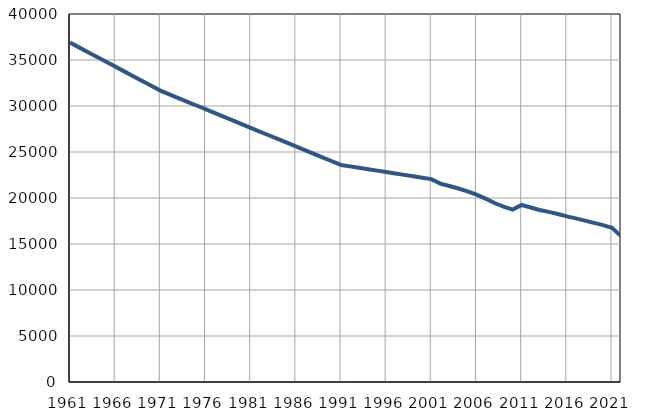
| Category | Population
size |
|---|---|
| 1961.0 | 36896 |
| 1962.0 | 36374 |
| 1963.0 | 35851 |
| 1964.0 | 35328 |
| 1965.0 | 34806 |
| 1966.0 | 34284 |
| 1967.0 | 33762 |
| 1968.0 | 33239 |
| 1969.0 | 32717 |
| 1970.0 | 32194 |
| 1971.0 | 31672 |
| 1972.0 | 31267 |
| 1973.0 | 30864 |
| 1974.0 | 30459 |
| 1975.0 | 30055 |
| 1976.0 | 29650 |
| 1977.0 | 29246 |
| 1978.0 | 28842 |
| 1979.0 | 28438 |
| 1980.0 | 28034 |
| 1981.0 | 27629 |
| 1982.0 | 27225 |
| 1983.0 | 26821 |
| 1984.0 | 26417 |
| 1985.0 | 26014 |
| 1986.0 | 25610 |
| 1987.0 | 25206 |
| 1988.0 | 24801 |
| 1989.0 | 24398 |
| 1990.0 | 23994 |
| 1991.0 | 23590 |
| 1992.0 | 23436 |
| 1993.0 | 23282 |
| 1994.0 | 23128 |
| 1995.0 | 22974 |
| 1996.0 | 22820 |
| 1997.0 | 22667 |
| 1998.0 | 22513 |
| 1999.0 | 22359 |
| 2000.0 | 22205 |
| 2001.0 | 22051 |
| 2002.0 | 21562 |
| 2003.0 | 21308 |
| 2004.0 | 21036 |
| 2005.0 | 20730 |
| 2006.0 | 20361 |
| 2007.0 | 19930 |
| 2008.0 | 19452 |
| 2009.0 | 19056 |
| 2010.0 | 18740 |
| 2011.0 | 19243 |
| 2012.0 | 18963 |
| 2013.0 | 18694 |
| 2014.0 | 18488 |
| 2015.0 | 18262 |
| 2016.0 | 18006 |
| 2017.0 | 17787 |
| 2018.0 | 17545 |
| 2019.0 | 17290 |
| 2020.0 | 17051 |
| 2021.0 | 16757 |
| 2022.0 | 15869 |